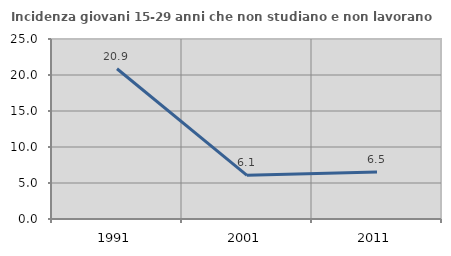
| Category | Incidenza giovani 15-29 anni che non studiano e non lavorano  |
|---|---|
| 1991.0 | 20.863 |
| 2001.0 | 6.061 |
| 2011.0 | 6.522 |